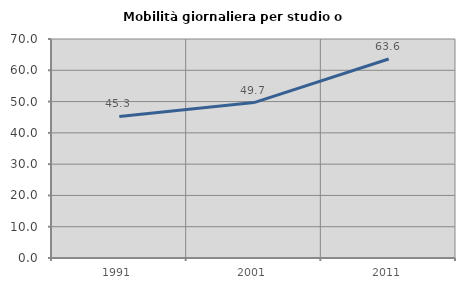
| Category | Mobilità giornaliera per studio o lavoro |
|---|---|
| 1991.0 | 45.255 |
| 2001.0 | 49.669 |
| 2011.0 | 63.621 |